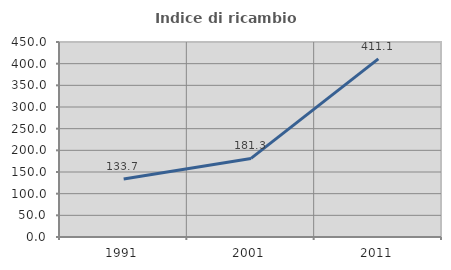
| Category | Indice di ricambio occupazionale  |
|---|---|
| 1991.0 | 133.662 |
| 2001.0 | 181.285 |
| 2011.0 | 411.111 |